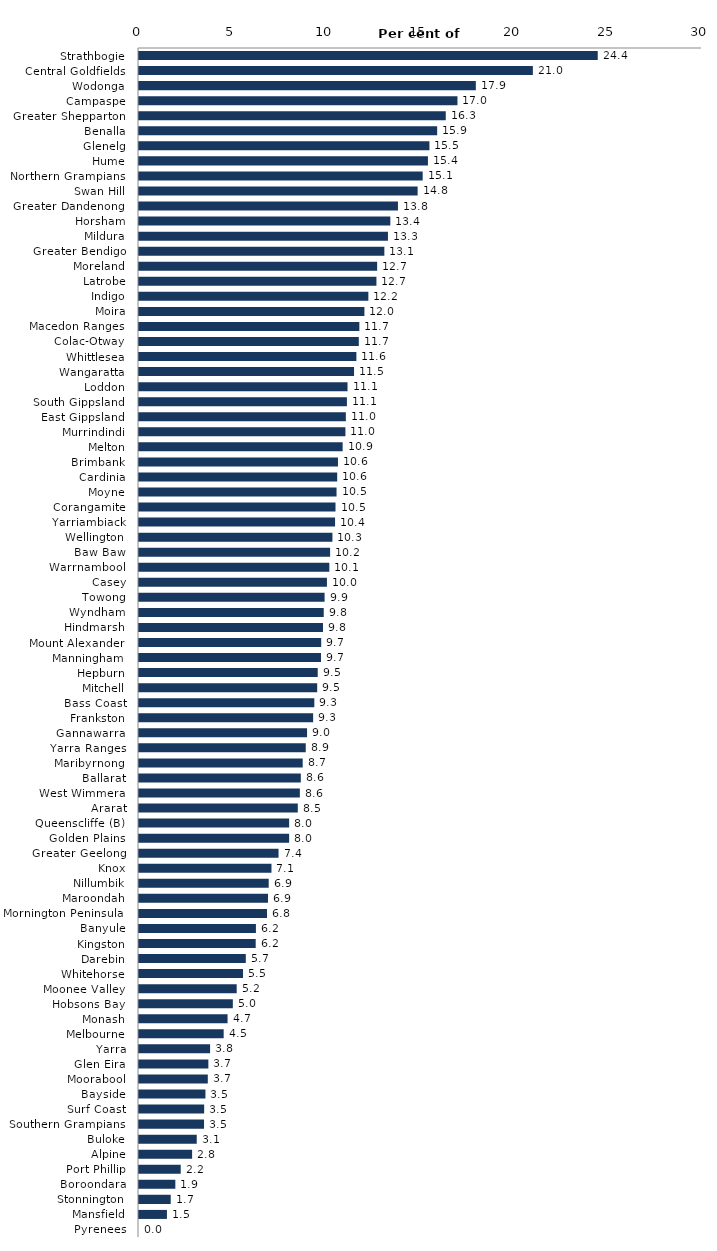
| Category | Series 0 |
|---|---|
| Strathbogie | 24.444 |
| Central Goldfields | 20.988 |
| Wodonga | 17.949 |
| Campaspe | 16.97 |
| Greater Shepparton | 16.346 |
| Benalla | 15.888 |
| Glenelg | 15.476 |
| Hume | 15.397 |
| Northern Grampians | 15.116 |
| Swan Hill | 14.847 |
| Greater Dandenong | 13.799 |
| Horsham | 13.393 |
| Mildura | 13.265 |
| Greater Bendigo | 13.074 |
| Moreland | 12.69 |
| Latrobe | 12.652 |
| Indigo | 12.222 |
| Moira | 12.012 |
| Macedon Ranges | 11.742 |
| Colac-Otway | 11.712 |
| Whittlesea | 11.584 |
| Wangaratta | 11.458 |
| Loddon | 11.111 |
| South Gippsland | 11.079 |
| East Gippsland | 11.022 |
| Murrindindi | 11 |
| Melton | 10.852 |
| Brimbank | 10.602 |
| Cardinia | 10.561 |
| Moyne | 10.526 |
| Corangamite | 10.471 |
| Yarriambiack | 10.448 |
| Wellington | 10.307 |
| Baw Baw | 10.184 |
| Warrnambool | 10.142 |
| Casey | 10.014 |
| Towong | 9.89 |
| Wyndham | 9.844 |
| Hindmarsh | 9.804 |
| Mount Alexander | 9.709 |
| Manningham | 9.698 |
| Hepburn | 9.524 |
| Mitchell | 9.495 |
| Bass Coast | 9.343 |
| Frankston | 9.28 |
| Gannawarra | 8.955 |
| Yarra Ranges | 8.885 |
| Maribyrnong | 8.722 |
| Ballarat | 8.622 |
| West Wimmera | 8.571 |
| Ararat | 8.462 |
| Queenscliffe (B) | 8 |
| Golden Plains | 8 |
| Greater Geelong | 7.436 |
| Knox | 7.059 |
| Nillumbik | 6.911 |
| Maroondah | 6.874 |
| Mornington Peninsula | 6.821 |
| Banyule | 6.23 |
| Kingston | 6.218 |
| Darebin | 5.691 |
| Whitehorse | 5.543 |
| Moonee Valley | 5.206 |
| Hobsons Bay | 5 |
| Monash | 4.719 |
| Melbourne | 4.512 |
| Yarra | 3.788 |
| Glen Eira | 3.696 |
| Moorabool | 3.667 |
| Bayside | 3.541 |
| Surf Coast | 3.472 |
| Southern Grampians | 3.465 |
| Buloke | 3.077 |
| Alpine | 2.83 |
| Port Phillip | 2.222 |
| Boroondara | 1.937 |
| Stonnington | 1.69 |
| Mansfield | 1.489 |
| Pyrenees | 0 |